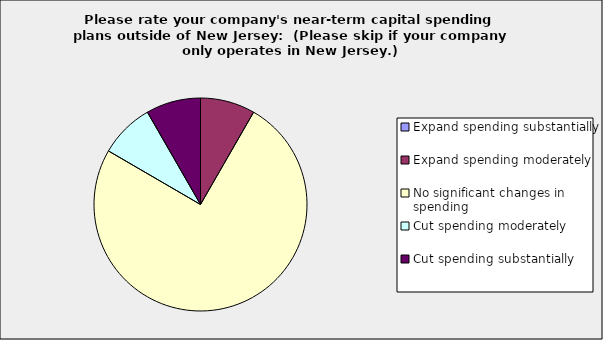
| Category | Series 0 |
|---|---|
| Expand spending substantially | 0 |
| Expand spending moderately | 0.083 |
| No significant changes in spending | 0.75 |
| Cut spending moderately | 0.083 |
| Cut spending substantially | 0.083 |